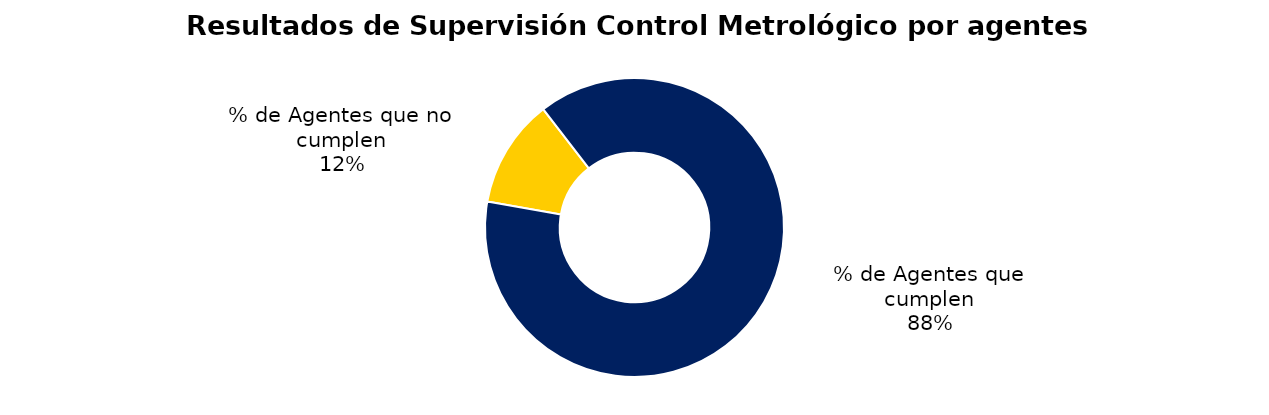
| Category | Series 0 |
|---|---|
| % de Agentes que no cumplen | 26 |
| % de Agentes que cumplen | 195 |